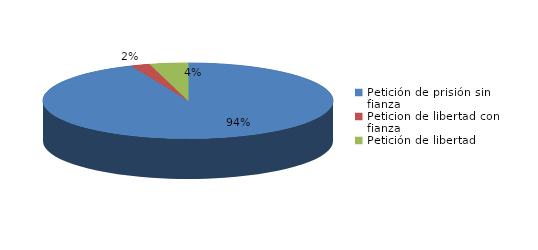
| Category | Series 0 |
|---|---|
| Petición de prisión sin fianza | 132 |
| Peticion de libertad con fianza | 3 |
| Petición de libertad | 6 |